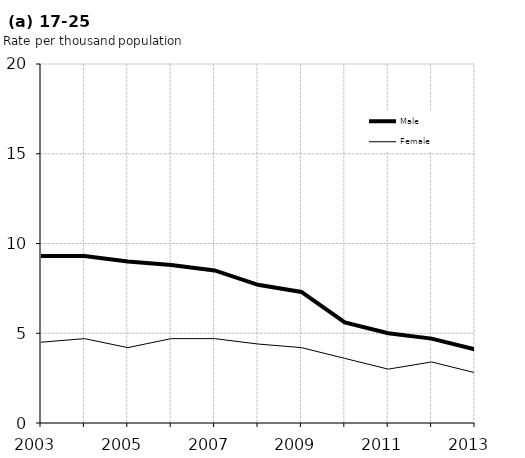
| Category | Male | Female |
|---|---|---|
| 2003.0 | 9.3 | 4.5 |
| 2004.0 | 9.3 | 4.7 |
| 2005.0 | 9 | 4.2 |
| 2006.0 | 8.8 | 4.7 |
| 2007.0 | 8.5 | 4.7 |
| 2008.0 | 7.7 | 4.4 |
| 2009.0 | 7.3 | 4.2 |
| 2010.0 | 5.6 | 3.6 |
| 2011.0 | 5 | 3 |
| 2012.0 | 4.7 | 3.4 |
| 2013.0 | 4.1 | 2.8 |